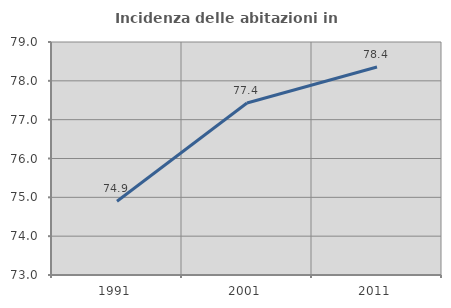
| Category | Incidenza delle abitazioni in proprietà  |
|---|---|
| 1991.0 | 74.9 |
| 2001.0 | 77.428 |
| 2011.0 | 78.356 |